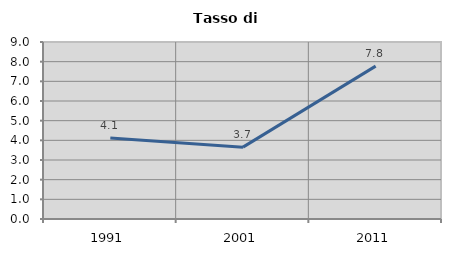
| Category | Tasso di disoccupazione   |
|---|---|
| 1991.0 | 4.124 |
| 2001.0 | 3.654 |
| 2011.0 | 7.774 |